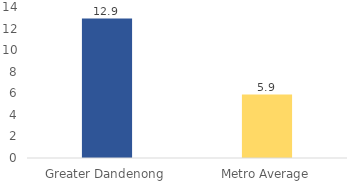
| Category | Series 0 |
|---|---|
| Greater Dandenong | 12.934 |
| Metro Average | 5.887 |